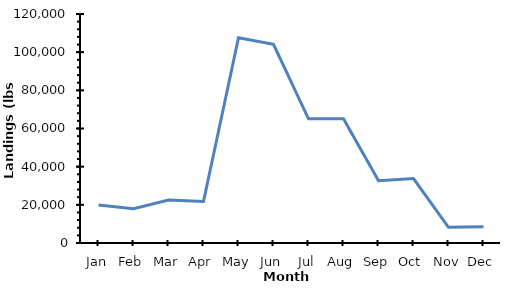
| Category | Series 0 |
|---|---|
| Jan | 19870.949 |
| Feb | 17947.954 |
| Mar | 22467.802 |
| Apr | 21743.034 |
| May | 107596.461 |
| Jun | 104125.607 |
| Jul | 65075.722 |
| Aug | 65075.722 |
| Sep | 32658.307 |
| Oct | 33746.918 |
| Nov | 8211.167 |
| Dec | 8484.872 |